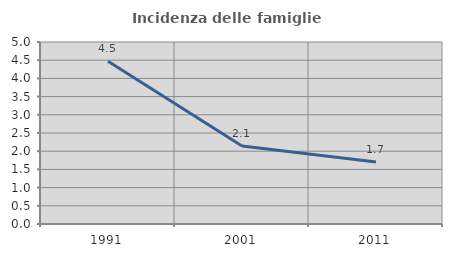
| Category | Incidenza delle famiglie numerose |
|---|---|
| 1991.0 | 4.468 |
| 2001.0 | 2.145 |
| 2011.0 | 1.701 |